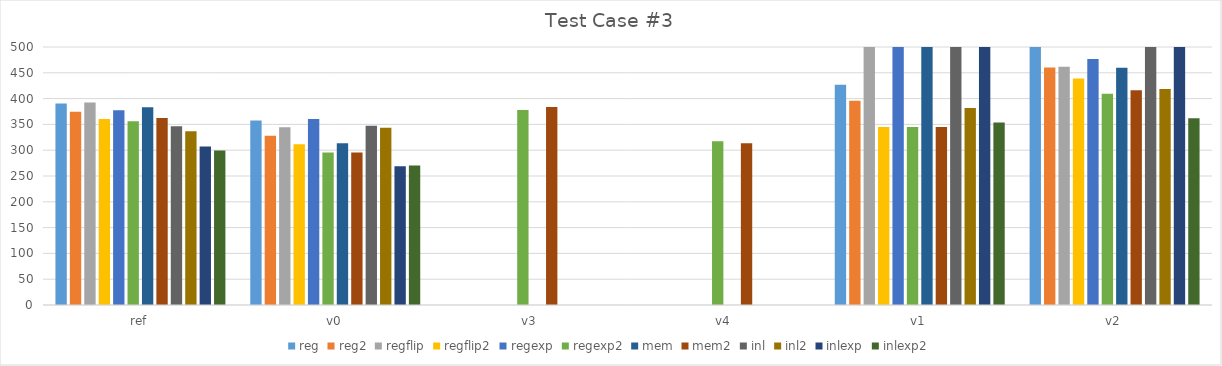
| Category | reg | reg2 | regflip | regflip2 | regexp | regexp2 | mem | mem2 | inl | inl2 | inlexp | inlexp2 |
|---|---|---|---|---|---|---|---|---|---|---|---|---|
| ref | 390.44 | 374.705 | 392.442 | 360.31 | 377.431 | 356.34 | 383.171 | 362.165 | 346.268 | 336.924 | 307.261 | 299.629 |
| v0 | 357.444 | 327.853 | 344.485 | 311.517 | 360.449 | 295.468 | 313.558 | 295.705 | 347.476 | 343.327 | 268.889 | 270.224 |
| v3 | 0 | 0 | 0 | 0 | 0 | 377.779 | 0 | 383.648 | 0 | 0 | 0 | 0 |
| v4 | 0 | 0 | 0 | 0 | 0 | 317.411 | 0 | 313.327 | 0 | 0 | 0 | 0 |
| v1 | 427.02 | 395.731 | 603.473 | 345.069 | 549.451 | 344.77 | 550.754 | 344.778 | 583.307 | 381.553 | 550.158 | 353.603 |
| v2 | 588.261 | 460.388 | 461.816 | 438.858 | 476.586 | 409.269 | 459.577 | 416.293 | 583.537 | 418.452 | 611.503 | 362.092 |